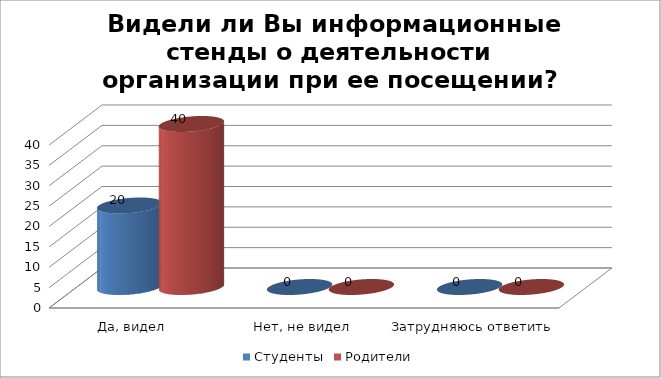
| Category | Студенты | Родители |
|---|---|---|
| Да, видел | 20 | 40 |
| Нет, не видел | 0 | 0 |
| Затрудняюсь ответить | 0 | 0 |